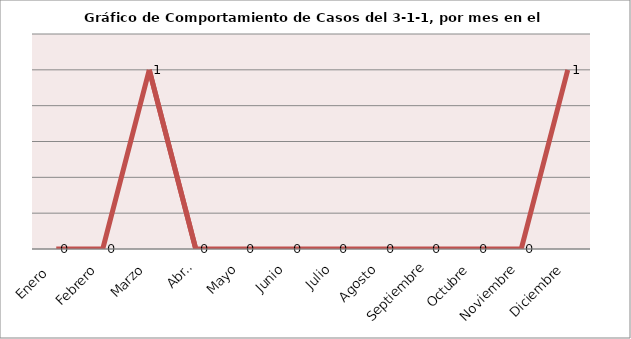
| Category | Series 0 |
|---|---|
| Enero  | 0 |
| Febrero | 0 |
| Marzo | 1 |
| Abril | 0 |
| Mayo | 0 |
| Junio | 0 |
| Julio | 0 |
| Agosto | 0 |
| Septiembre | 0 |
| Octubre | 0 |
| Noviembre | 0 |
| Diciembre | 1 |